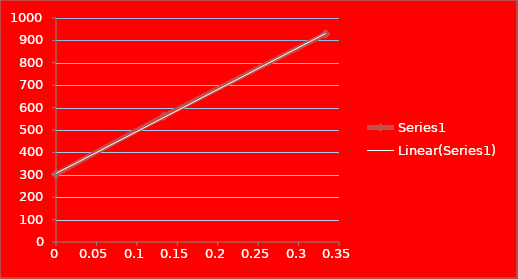
| Category | Series 0 |
|---|---|
| 0.0 | 302.592 |
| 0.13333 | 561.429 |
| 0.3333 | 928.429 |